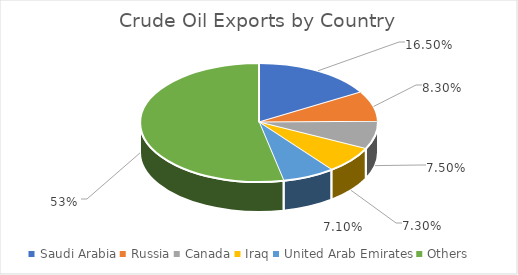
| Category | Percentage |
|---|---|
| Saudi Arabia | 0.165 |
| Russia | 0.083 |
| Canada | 0.075 |
| Iraq | 0.073 |
| United Arab Emirates | 0.071 |
| Others | 0.533 |